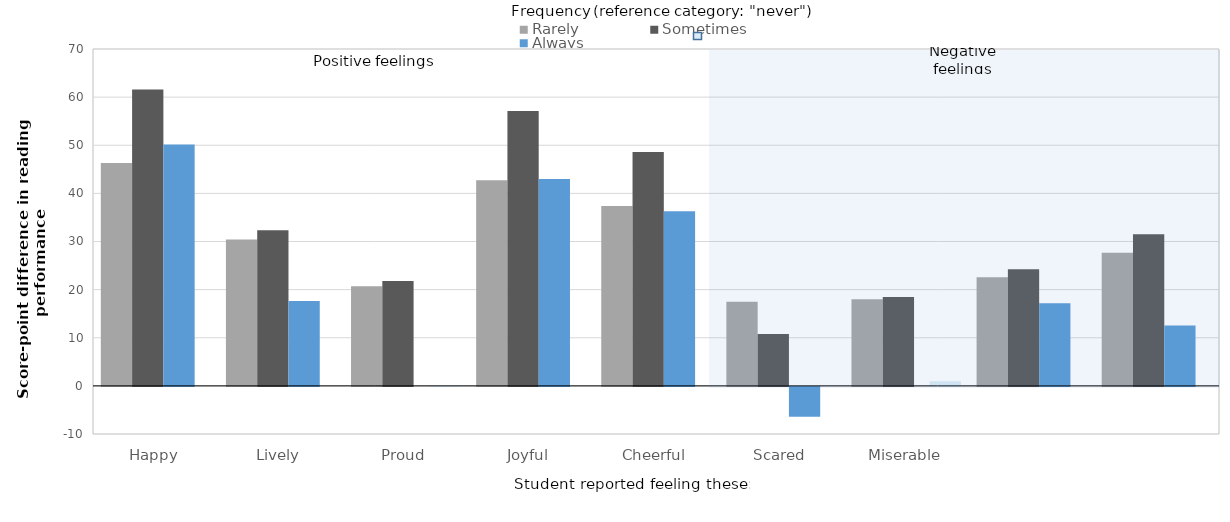
| Category | Rarely | Rarely, NS | Sometimes | Sometimes, NS | Always | Always, NS |
|---|---|---|---|---|---|---|
| Happy | 46.331 | 0 | 61.597 | 0 | 50.163 | 0 |
| Lively | 30.398 | 0 | 32.356 | 0 | 17.636 | 0 |
| Proud | 20.711 | 0 | 21.786 | 0 | 0 | -0.053 |
| Joyful | 42.712 | 0 | 57.104 | 0 | 42.981 | 0 |
| Cheerful | 37.39 | 0 | 48.612 | 0 | 36.267 | 0 |
| Scared | 17.468 | 0 | 10.766 | 0 | -6.188 | 0 |
| Miserable | 18.007 | 0 | 18.455 | 0 | 0 | 0.964 |